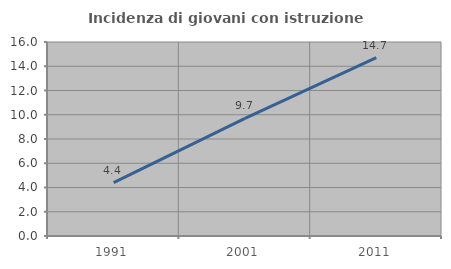
| Category | Incidenza di giovani con istruzione universitaria |
|---|---|
| 1991.0 | 4.397 |
| 2001.0 | 9.709 |
| 2011.0 | 14.706 |